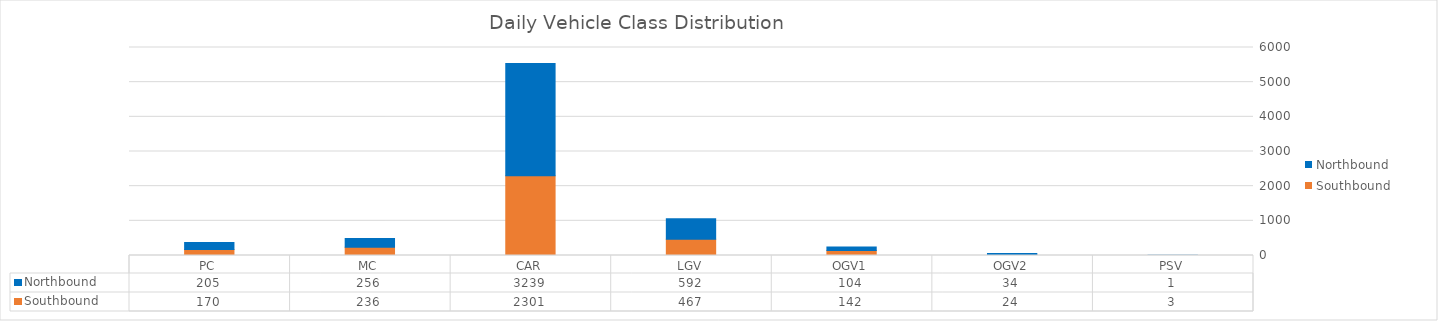
| Category | Southbound | Northbound |
|---|---|---|
| PC | 170 | 205 |
| MC | 236 | 256 |
| CAR | 2301 | 3239 |
| LGV | 467 | 592 |
| OGV1 | 142 | 104 |
| OGV2 | 24 | 34 |
| PSV | 3 | 1 |